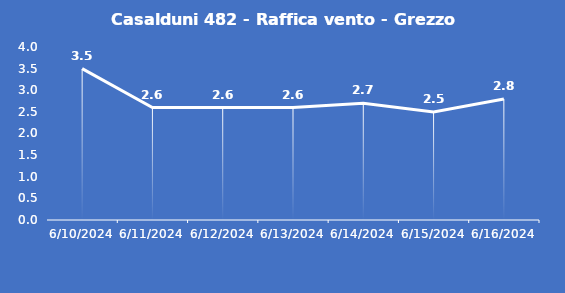
| Category | Casalduni 482 - Raffica vento - Grezzo (m/s) |
|---|---|
| 6/10/24 | 3.5 |
| 6/11/24 | 2.6 |
| 6/12/24 | 2.6 |
| 6/13/24 | 2.6 |
| 6/14/24 | 2.7 |
| 6/15/24 | 2.5 |
| 6/16/24 | 2.8 |